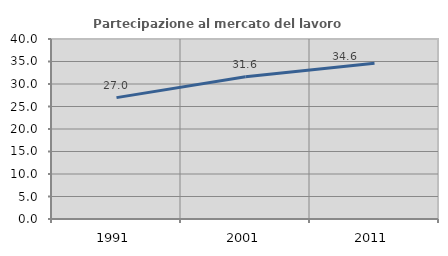
| Category | Partecipazione al mercato del lavoro  femminile |
|---|---|
| 1991.0 | 26.976 |
| 2001.0 | 31.608 |
| 2011.0 | 34.631 |